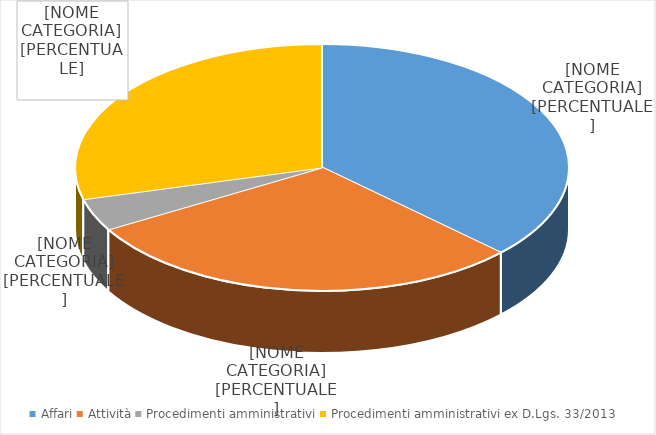
| Category | Series 0 |
|---|---|
| Affari | 307 |
| Attività | 244 |
| Procedimenti amministrativi | 35 |
| Procedimenti amministrativi ex D.Lgs. 33/2013 | 241 |